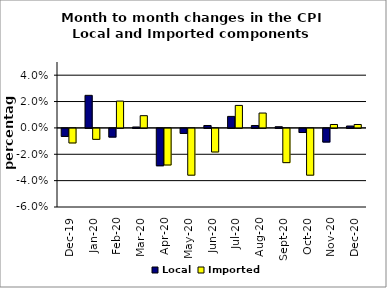
| Category | Local | Imported |
|---|---|---|
| 2019-12-01 | -0.006 | -0.011 |
| 2020-01-01 | 0.025 | -0.008 |
| 2020-02-01 | -0.007 | 0.02 |
| 2020-03-01 | 0.001 | 0.009 |
| 2020-04-01 | -0.028 | -0.028 |
| 2020-05-01 | -0.004 | -0.035 |
| 2020-06-01 | 0.002 | -0.018 |
| 2020-07-01 | 0.009 | 0.017 |
| 2020-08-01 | 0.002 | 0.011 |
| 2020-09-01 | 0.001 | -0.026 |
| 2020-10-01 | -0.003 | -0.035 |
| 2020-11-01 | -0.01 | 0.003 |
| 2020-12-01 | 0.001 | 0.003 |